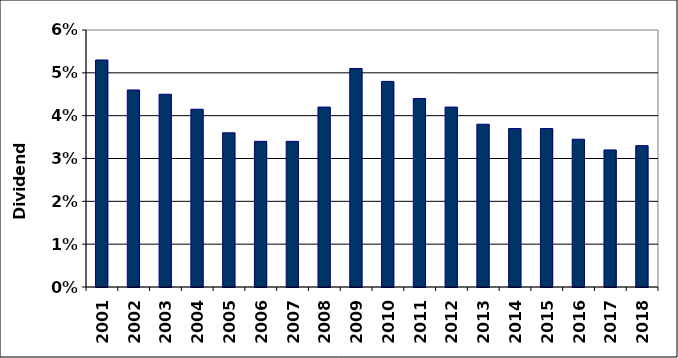
| Category | Series 0 |
|---|---|
| 2001.0 | 0.053 |
| 2002.0 | 0.046 |
| 2003.0 | 0.045 |
| 2004.0 | 0.042 |
| 2005.0 | 0.036 |
| 2006.0 | 0.034 |
| 2007.0 | 0.034 |
| 2008.0 | 0.042 |
| 2009.0 | 0.051 |
| 2010.0 | 0.048 |
| 2011.0 | 0.044 |
| 2012.0 | 0.042 |
| 2013.0 | 0.038 |
| 2014.0 | 0.037 |
| 2015.0 | 0.037 |
| 2016.0 | 0.034 |
| 2017.0 | 0.032 |
| 2018.0 | 0.033 |